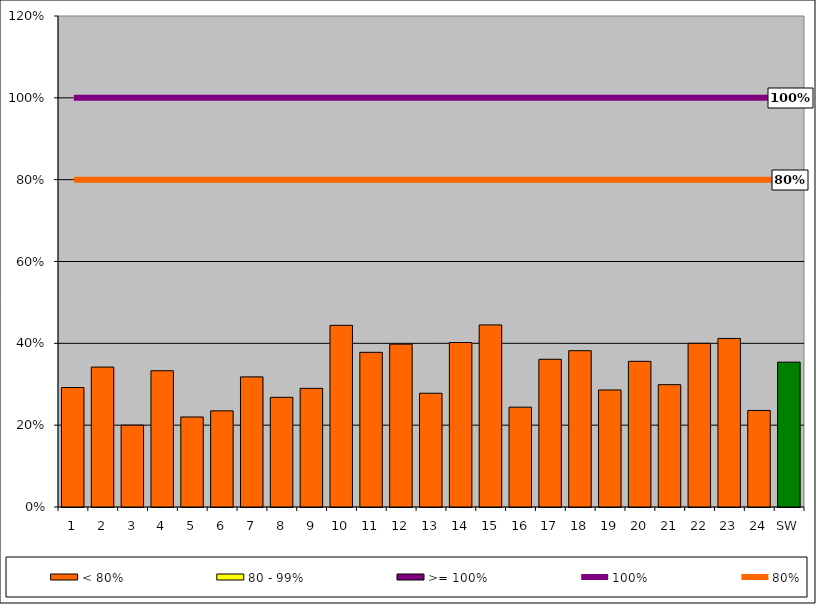
| Category | < 80% | 80 - 99% | >= 100% |
|---|---|---|---|
| 1 | 0.292 | 0 | 0 |
| 2 | 0.342 | 0 | 0 |
| 3 | 0.2 | 0 | 0 |
| 4 | 0.333 | 0 | 0 |
| 5 | 0.22 | 0 | 0 |
| 6 | 0.235 | 0 | 0 |
| 7 | 0.318 | 0 | 0 |
| 8 | 0.268 | 0 | 0 |
| 9 | 0.29 | 0 | 0 |
| 10 | 0.444 | 0 | 0 |
| 11 | 0.378 | 0 | 0 |
| 12 | 0.398 | 0 | 0 |
| 13 | 0.278 | 0 | 0 |
| 14 | 0.402 | 0 | 0 |
| 15 | 0.445 | 0 | 0 |
| 16 | 0.244 | 0 | 0 |
| 17 | 0.361 | 0 | 0 |
| 18 | 0.382 | 0 | 0 |
| 19 | 0.286 | 0 | 0 |
| 20 | 0.356 | 0 | 0 |
| 21 | 0.299 | 0 | 0 |
| 22 | 0.4 | 0 | 0 |
| 23 | 0.412 | 0 | 0 |
| 24 | 0.236 | 0 | 0 |
| SW | 0.354 | 0 | 0 |